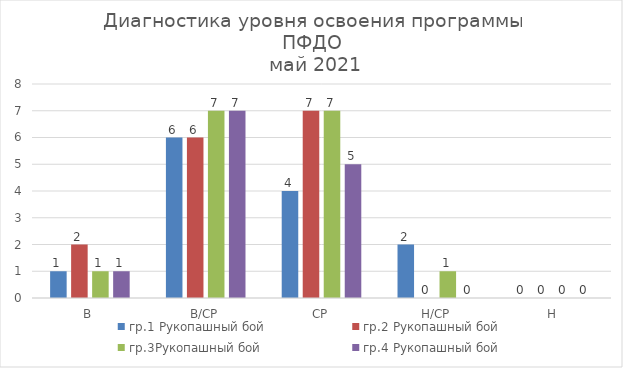
| Category | гр.1 Рукопашный бой | гр.2 Рукопашный бой | гр.3Рукопашный бой | гр.4 Рукопашный бой |
|---|---|---|---|---|
| В | 1 | 2 | 1 | 1 |
| В/СР | 6 | 6 | 7 | 7 |
| СР | 4 | 7 | 7 | 5 |
| Н/СР | 2 | 0 | 1 | 0 |
| Н | 0 | 0 | 0 | 0 |